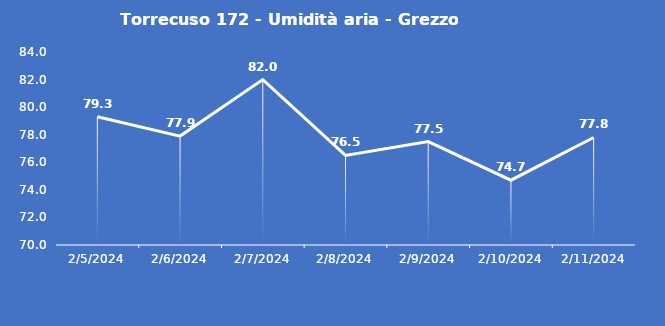
| Category | Torrecuso 172 - Umidità aria - Grezzo (%) |
|---|---|
| 2/5/24 | 79.3 |
| 2/6/24 | 77.9 |
| 2/7/24 | 82 |
| 2/8/24 | 76.5 |
| 2/9/24 | 77.5 |
| 2/10/24 | 74.7 |
| 2/11/24 | 77.8 |